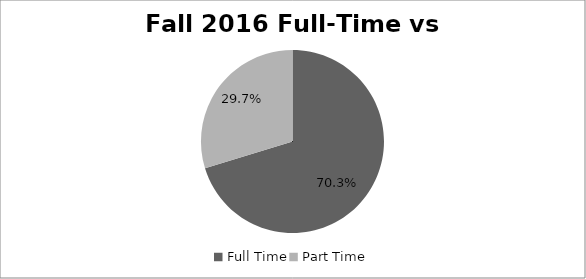
| Category | Series 0 |
|---|---|
| Full Time | 0.703 |
| Part Time | 0.297 |